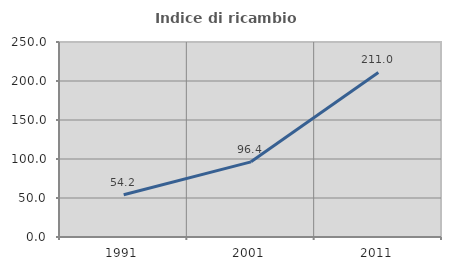
| Category | Indice di ricambio occupazionale  |
|---|---|
| 1991.0 | 54.217 |
| 2001.0 | 96.35 |
| 2011.0 | 210.989 |